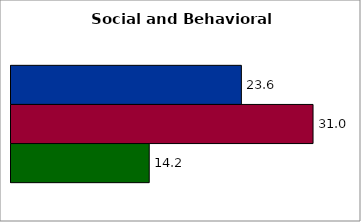
| Category | 50 states and D.C. | SREB states | State |
|---|---|---|---|
| 0 | 23.646 | 31.002 | 14.188 |